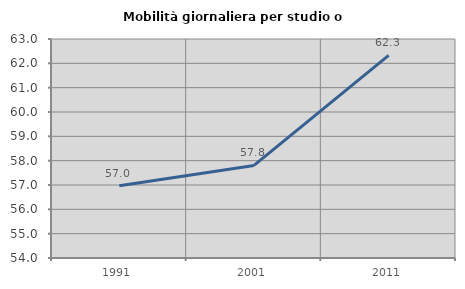
| Category | Mobilità giornaliera per studio o lavoro |
|---|---|
| 1991.0 | 56.97 |
| 2001.0 | 57.804 |
| 2011.0 | 62.327 |